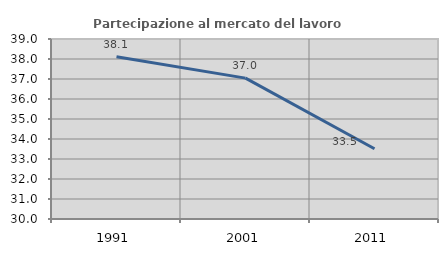
| Category | Partecipazione al mercato del lavoro  femminile |
|---|---|
| 1991.0 | 38.115 |
| 2001.0 | 37.043 |
| 2011.0 | 33.514 |